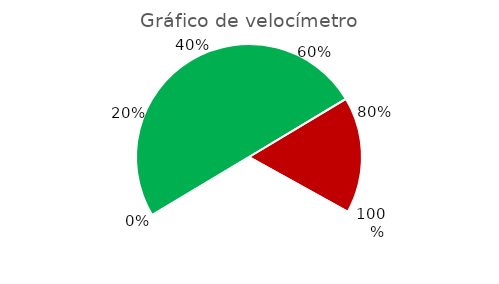
| Category | Series 0 |
|---|---|
| Valor 1 | 0.75 |
| Valor 2 | 0.25 |
| Segmento Blanco | 0.5 |